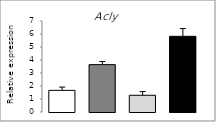
| Category | Series 0 |
|---|---|
| 0 | 1.664 |
| 1 | 3.644 |
| 2 | 1.287 |
| 3 | 5.82 |